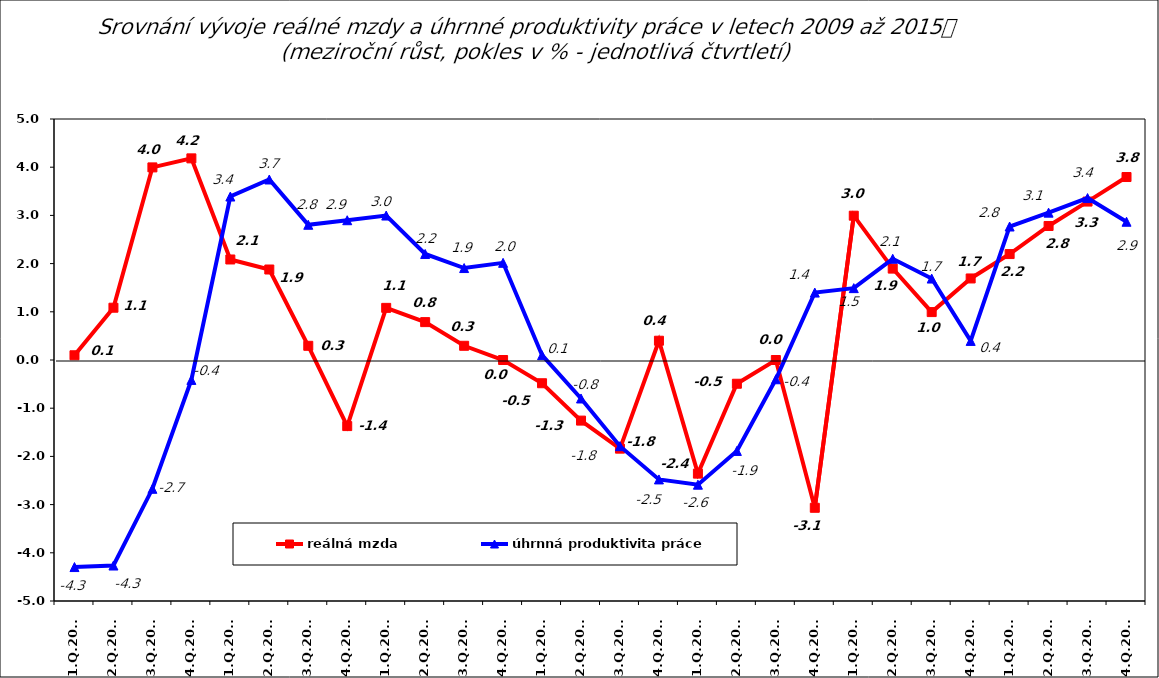
| Category | reálná mzda | úhrnná produktivita práce |
|---|---|---|
| 1.Q.2009 | 0.098 | -4.296 |
| 2.Q.2009 | 1.085 | -4.264 |
| 3.Q.2009 | 3.996 | -2.672 |
| 4.Q.2009 | 4.183 | -0.413 |
| 1.Q.2010 | 2.085 | 3.392 |
| 2.Q.2010 | 1.877 | 3.745 |
| 3.Q.2010 | 0.294 | 2.806 |
| 4.Q.2010 | -1.371 | 2.9 |
| 1.Q.2011 | 1.082 | 2.997 |
| 2.Q.2011 | 0.786 | 2.2 |
| 3.Q.2011 | 0.295 | 1.908 |
| 4.Q.2011 | 0 | 2.016 |
| 1.Q.2012 | -0.482 | 0.1 |
| 2.Q.2012 | -1.257 | -0.798 |
| 3.Q.2012 | -1.839 | -1.787 |
| 4.Q.2012 | 0.4 | -2.478 |
| 1.Q.2013 | -2.358 | -2.587 |
| 2.Q.2013 | -0.493 | -1.887 |
| 3.Q.2013 | 0 | -0.4 |
| 4.Q.2013 | -3.066 | 1.399 |
| 1.Q.2014 | 2.994 | 1.491 |
| 2.Q.2014 | 1.896 | 2.1 |
| 3.Q.2014 | 0.994 | 1.69 |
| 4.Q.2014 | 1.692 | 0.396 |
| 1.Q.2015 | 2.198 | 2.77 |
| 2.Q.2015 | 2.781 | 3.057 |
| 3.Q.2015 | 3.287 | 3.36 |
| 4.Q.2015 | 3.796 | 2.868 |